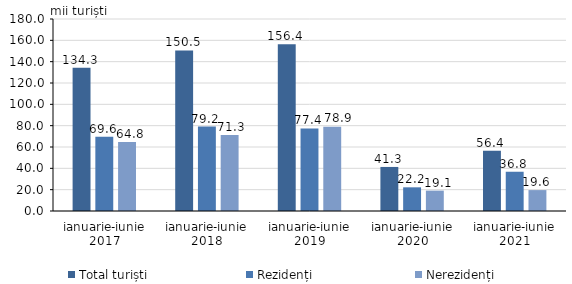
| Category | Total turiști | Rezidenți  | Nerezidenți  |
|---|---|---|---|
| ianuarie-iunie 2017 | 134.3 | 69.6 | 64.8 |
| ianuarie-iunie 2018 | 150.5 | 79.2 | 71.3 |
| ianuarie-iunie 2019 | 156.4 | 77.4 | 78.9 |
| ianuarie-iunie 2020 | 41.3 | 22.2 | 19.1 |
| ianuarie-iunie 2021 | 56.4 | 36.8 | 19.6 |